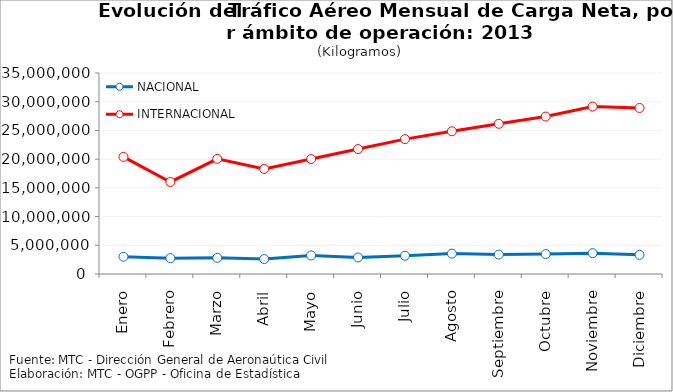
| Category | NACIONAL | INTERNACIONAL |
|---|---|---|
| Enero | 2999254 | 20392082 |
| Febrero | 2758304 | 16027978 |
| Marzo | 2820191 | 20056199 |
| Abril | 2603158 | 18288556 |
| Mayo | 3232405 | 20017995 |
| Junio | 2877462 | 21753074 |
| Julio | 3184495 | 23484612 |
| Agosto | 3548624 | 24854850 |
| Septiembre | 3376725 | 26151774 |
| Octubre | 3472954 | 27413175 |
| Noviembre | 3631850 | 29152650 |
| Diciembre | 3336571 | 28911805 |